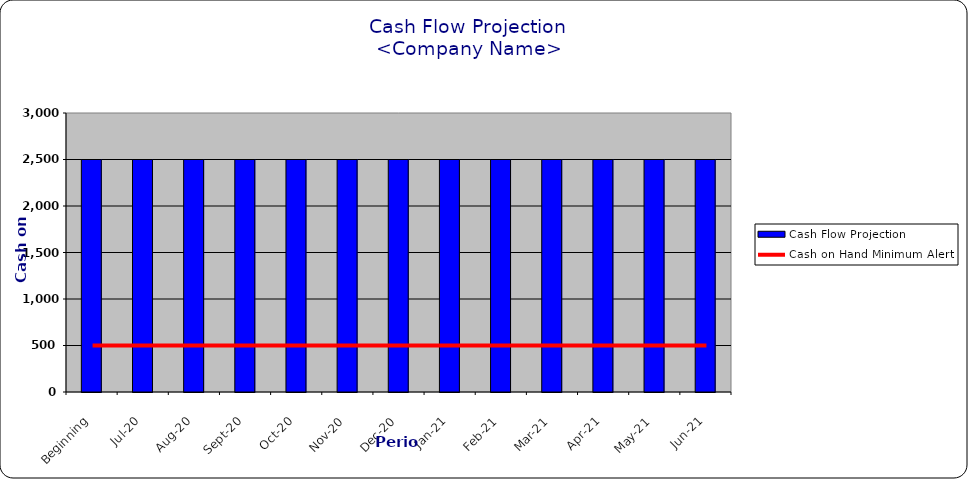
| Category | Cash Flow Projection |
|---|---|
| Beginning | 2500 |
| Jul-20 | 2500 |
| Aug-20 | 2500 |
| Sep-20 | 2500 |
| Oct-20 | 2500 |
| Nov-20 | 2500 |
| Dec-20 | 2500 |
| Jan-21 | 2500 |
| Feb-21 | 2500 |
| Mar-21 | 2500 |
| Apr-21 | 2500 |
| May-21 | 2500 |
| Jun-21 | 2500 |